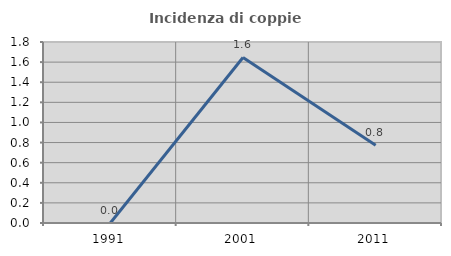
| Category | Incidenza di coppie miste |
|---|---|
| 1991.0 | 0 |
| 2001.0 | 1.646 |
| 2011.0 | 0.772 |